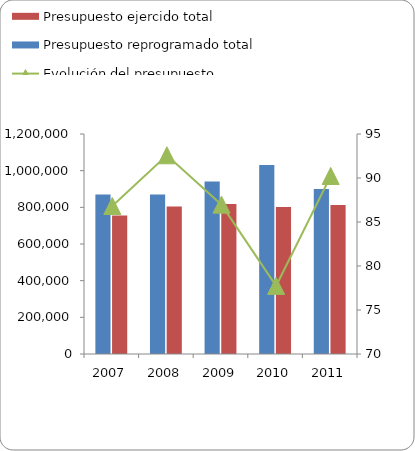
| Category | Presupuesto reprogramado total | Presupuesto ejercido total |
|---|---|---|
| 2007 | 870076 | 755421 |
| 2008 | 869370 | 804875 |
| 2009 | 941182 | 818576 |
| 2010 | 1031124 | 801583 |
| 2011 | 900614 | 812630 |